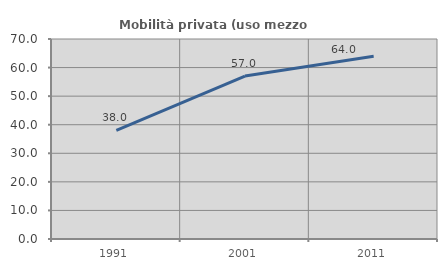
| Category | Mobilità privata (uso mezzo privato) |
|---|---|
| 1991.0 | 37.98 |
| 2001.0 | 57.012 |
| 2011.0 | 63.951 |